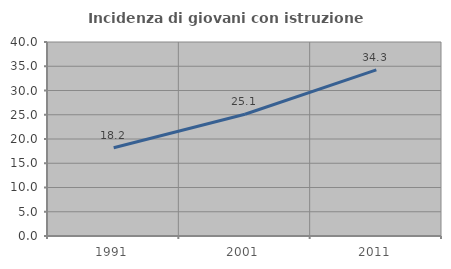
| Category | Incidenza di giovani con istruzione universitaria |
|---|---|
| 1991.0 | 18.193 |
| 2001.0 | 25.096 |
| 2011.0 | 34.256 |